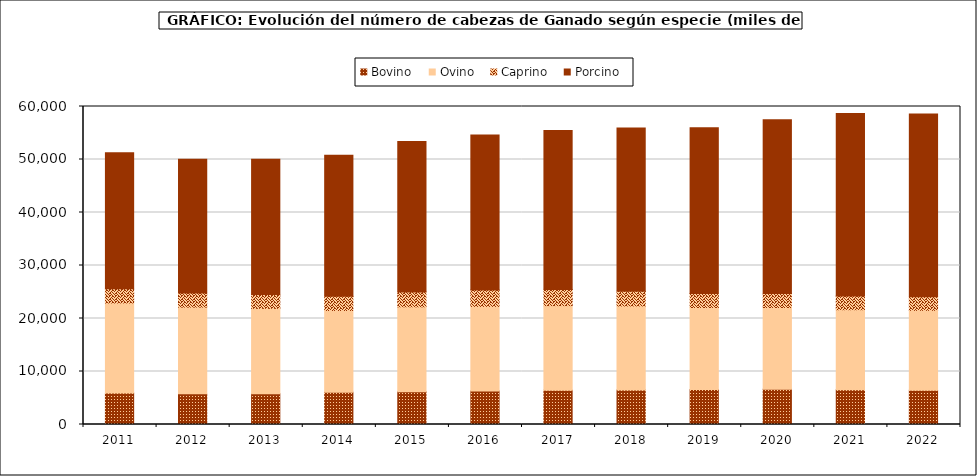
| Category | Bovino | Ovino | Caprino | Porcino |
|---|---|---|---|---|
| 2011.0 | 5923 | 17003 | 2693 | 25635 |
| 2012.0 | 5812.605 | 16339.373 | 2637.336 | 25250.377 |
| 2013.0 | 5802.22 | 16118.586 | 2609.989 | 25494.715 |
| 2014.0 | 6078.733 | 15431.804 | 2704.228 | 26567.578 |
| 2015.0 | 6182.908 | 16026.374 | 2801.064 | 28367.335 |
| 2016.0 | 6317.641 | 15962.892 | 3088.035 | 29231.595 |
| 2017.0 | 6465.747 | 15963.106 | 3059.731 | 29971.357 |
| 2018.0 | 6510.592 | 15852.525 | 2764.79 | 30804.102 |
| 2019.0 | 6600 | 15478 | 2659 | 31246 |
| 2020.0 | 6636 | 15440 | 2652 | 32795 |
| 2021.0 | 6576 | 15081 | 2590 | 34455 |
| 2022.0 | 6455 | 15081 | 2590 | 34455 |